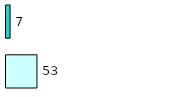
| Category | Series 0 | Series 1 |
|---|---|---|
| 0 | 53 | 7 |